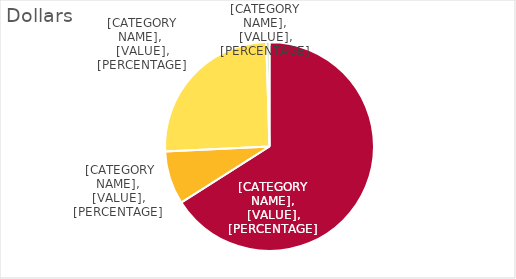
| Category | Series 0 |
|---|---|
| 4 Year Public | 245836524.496 |
| 2 Year Public | 30743029.49 |
| Private | 94089778.97 |
| Proprietary | 1842720.02 |